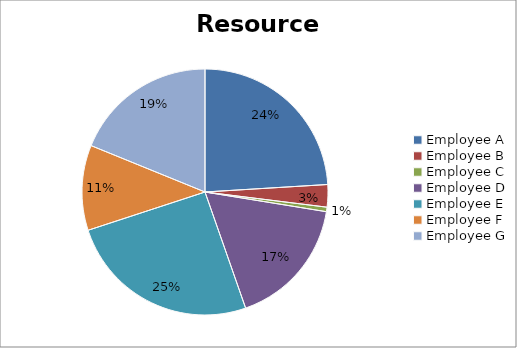
| Category | data |
|---|---|
| Employee A | 3060 |
| Employee B | 375 |
| Employee C | 75 |
| Employee D | 2175 |
| Employee E | 3225 |
| Employee F | 1425 |
| Employee G | 2400 |